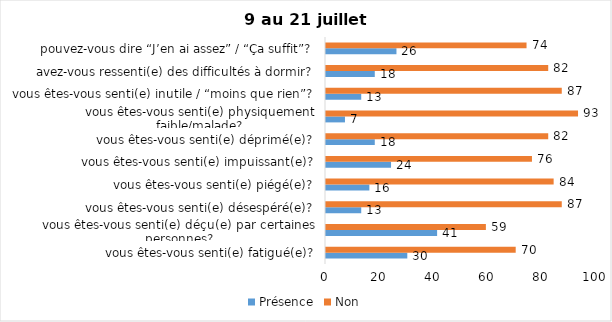
| Category | Présence | Non |
|---|---|---|
| vous êtes-vous senti(e) fatigué(e)? | 30 | 70 |
| vous êtes-vous senti(e) déçu(e) par certaines personnes? | 41 | 59 |
| vous êtes-vous senti(e) désespéré(e)? | 13 | 87 |
| vous êtes-vous senti(e) piégé(e)? | 16 | 84 |
| vous êtes-vous senti(e) impuissant(e)? | 24 | 76 |
| vous êtes-vous senti(e) déprimé(e)? | 18 | 82 |
| vous êtes-vous senti(e) physiquement faible/malade? | 7 | 93 |
| vous êtes-vous senti(e) inutile / “moins que rien”? | 13 | 87 |
| avez-vous ressenti(e) des difficultés à dormir? | 18 | 82 |
| pouvez-vous dire “J’en ai assez” / “Ça suffit”? | 26 | 74 |